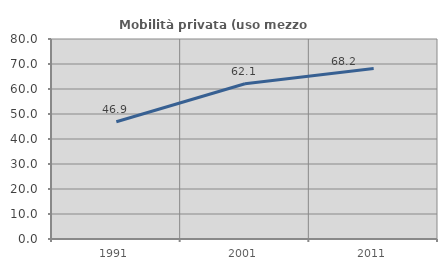
| Category | Mobilità privata (uso mezzo privato) |
|---|---|
| 1991.0 | 46.898 |
| 2001.0 | 62.109 |
| 2011.0 | 68.21 |